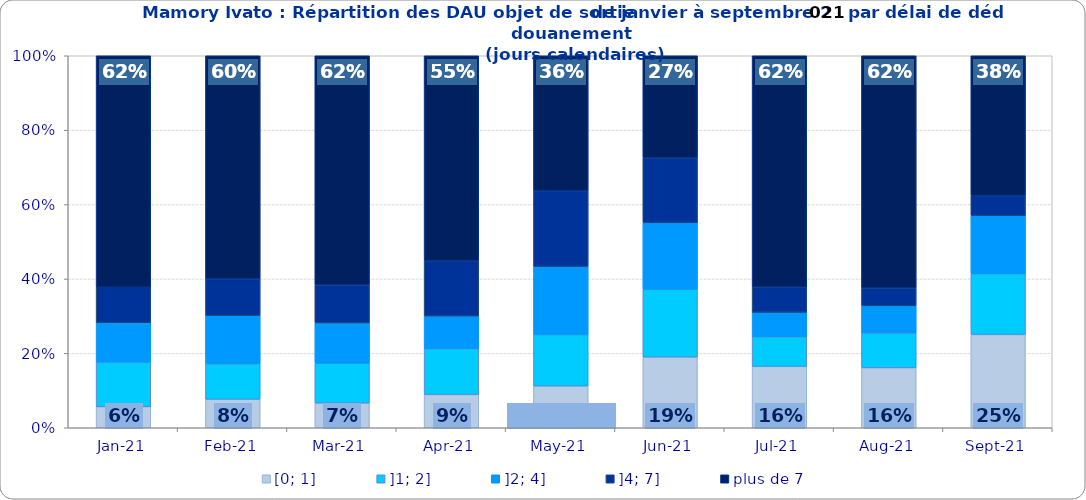
| Category | [0; 1] | ]1; 2] | ]2; 4] | ]4; 7] | plus de 7 |
|---|---|---|---|---|---|
| 2021-01-01 | 0.056 | 0.12 | 0.106 | 0.096 | 0.622 |
| 2021-02-01 | 0.077 | 0.095 | 0.13 | 0.099 | 0.6 |
| 2021-03-01 | 0.066 | 0.107 | 0.108 | 0.102 | 0.616 |
| 2021-04-01 | 0.089 | 0.123 | 0.088 | 0.149 | 0.551 |
| 2021-05-01 | 0.112 | 0.138 | 0.183 | 0.204 | 0.363 |
| 2021-06-01 | 0.19 | 0.182 | 0.179 | 0.175 | 0.274 |
| 2021-07-01 | 0.165 | 0.08 | 0.066 | 0.068 | 0.622 |
| 2021-08-01 | 0.161 | 0.093 | 0.073 | 0.048 | 0.624 |
| 2021-09-01 | 0.251 | 0.163 | 0.156 | 0.054 | 0.376 |